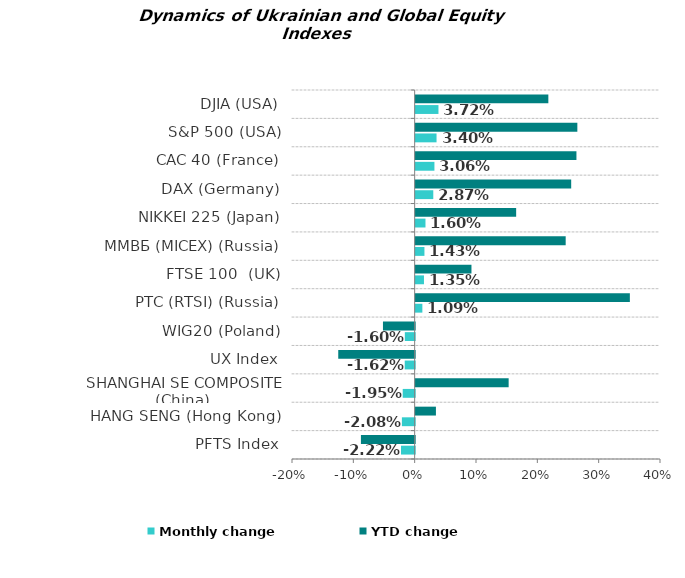
| Category | Monthly change | YTD change |
|---|---|---|
| PFTS Index | -0.022 | -0.088 |
| HANG SENG (Hong Kong) | -0.021 | 0.033 |
| SHANGHAI SE COMPOSITE (China) | -0.019 | 0.152 |
| UX Index | -0.016 | -0.125 |
| WIG20 (Poland) | -0.016 | -0.052 |
| РТС (RTSI) (Russia) | 0.011 | 0.349 |
| FTSE 100  (UK) | 0.014 | 0.091 |
| ММВБ (MICEX) (Russia) | 0.014 | 0.245 |
| NIKKEI 225 (Japan) | 0.016 | 0.164 |
| DAX (Germany) | 0.029 | 0.254 |
| CAC 40 (France) | 0.031 | 0.262 |
| S&P 500 (USA) | 0.034 | 0.264 |
| DJIA (USA) | 0.037 | 0.216 |